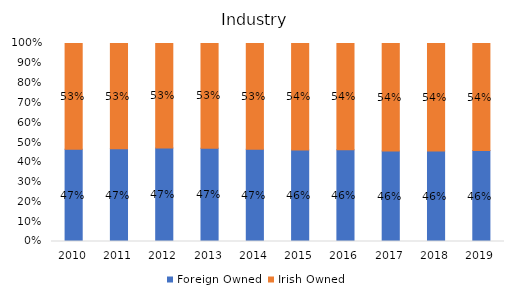
| Category | Foreign Owned | Irish Owned |
|---|---|---|
| 2010.0 | 0.466 | 0.534 |
| 2011.0 | 0.468 | 0.532 |
| 2012.0 | 0.472 | 0.528 |
| 2013.0 | 0.471 | 0.529 |
| 2014.0 | 0.466 | 0.534 |
| 2015.0 | 0.462 | 0.538 |
| 2016.0 | 0.463 | 0.537 |
| 2017.0 | 0.457 | 0.543 |
| 2018.0 | 0.456 | 0.544 |
| 2019.0 | 0.46 | 0.54 |